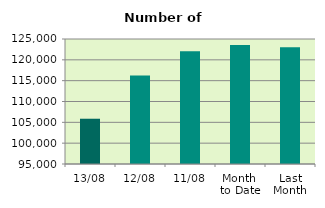
| Category | Series 0 |
|---|---|
| 13/08 | 105864 |
| 12/08 | 116226 |
| 11/08 | 122084 |
| Month 
to Date | 123539.8 |
| Last
Month | 122991 |